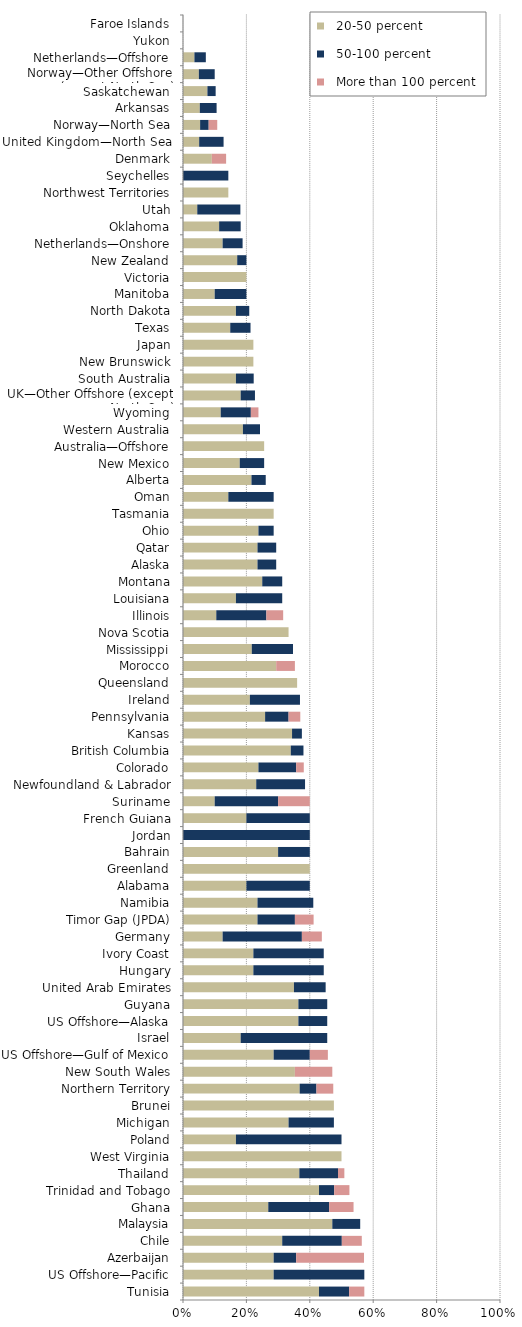
| Category |   20-50 percent |   50-100 percent |   More than 100 percent |
|---|---|---|---|
| Tunisia | 0.429 | 0.095 | 0.048 |
| US Offshore—Pacific | 0.286 | 0.286 | 0 |
| Azerbaijan | 0.286 | 0.071 | 0.214 |
| Chile | 0.313 | 0.188 | 0.063 |
| Malaysia | 0.471 | 0.088 | 0 |
| Ghana | 0.269 | 0.192 | 0.077 |
| Trinidad and Tobago | 0.429 | 0.048 | 0.048 |
| Thailand | 0.367 | 0.122 | 0.02 |
| West Virginia | 0.5 | 0 | 0 |
| Poland | 0.167 | 0.333 | 0 |
| Michigan | 0.333 | 0.143 | 0 |
| Brunei | 0.476 | 0 | 0 |
| Northern Territory | 0.368 | 0.053 | 0.053 |
| New South Wales | 0.353 | 0 | 0.118 |
| US Offshore—Gulf of Mexico | 0.286 | 0.114 | 0.057 |
| Israel | 0.182 | 0.273 | 0 |
| US Offshore—Alaska | 0.364 | 0.091 | 0 |
| Guyana | 0.364 | 0.091 | 0 |
| United Arab Emirates | 0.35 | 0.1 | 0 |
| Hungary | 0.222 | 0.222 | 0 |
| Ivory Coast | 0.222 | 0.222 | 0 |
| Germany | 0.125 | 0.25 | 0.063 |
| Timor Gap (JPDA) | 0.235 | 0.118 | 0.059 |
| Namibia | 0.235 | 0.176 | 0 |
| Alabama | 0.2 | 0.2 | 0 |
| Greenland | 0.4 | 0 | 0 |
| Bahrain | 0.3 | 0.1 | 0 |
| Jordan | 0 | 0.4 | 0 |
| French Guiana | 0.2 | 0.2 | 0 |
| Suriname | 0.1 | 0.2 | 0.1 |
| Newfoundland & Labrador | 0.231 | 0.154 | 0 |
| Colorado | 0.238 | 0.119 | 0.024 |
| British Columbia | 0.34 | 0.04 | 0 |
| Kansas | 0.344 | 0.031 | 0 |
| Pennsylvania | 0.259 | 0.074 | 0.037 |
| Ireland | 0.211 | 0.158 | 0 |
| Queensland | 0.36 | 0 | 0 |
| Morocco | 0.294 | 0 | 0.059 |
| Mississippi | 0.217 | 0.13 | 0 |
| Nova Scotia | 0.333 | 0 | 0 |
| Illinois | 0.105 | 0.158 | 0.053 |
| Louisiana | 0.167 | 0.146 | 0 |
| Montana | 0.25 | 0.063 | 0 |
| Alaska | 0.235 | 0.059 | 0 |
| Qatar | 0.235 | 0.059 | 0 |
| Ohio | 0.238 | 0.048 | 0 |
| Tasmania | 0.286 | 0 | 0 |
| Oman | 0.143 | 0.143 | 0 |
| Alberta | 0.216 | 0.045 | 0 |
| New Mexico | 0.179 | 0.077 | 0 |
| Australia—Offshore | 0.256 | 0 | 0 |
| Western Australia | 0.189 | 0.054 | 0 |
| Wyoming | 0.119 | 0.095 | 0.024 |
| UK—Other Offshore (except North Sea) | 0.182 | 0.045 | 0 |
| South Australia | 0.167 | 0.056 | 0 |
| New Brunswick | 0.222 | 0 | 0 |
| Japan | 0.222 | 0 | 0 |
| Texas | 0.149 | 0.064 | 0 |
| North Dakota | 0.167 | 0.042 | 0 |
| Manitoba | 0.1 | 0.1 | 0 |
| Victoria | 0.2 | 0 | 0 |
| New Zealand | 0.171 | 0.029 | 0 |
| Netherlands—Onshore | 0.125 | 0.063 | 0 |
| Oklahoma | 0.114 | 0.068 | 0 |
| Utah | 0.045 | 0.136 | 0 |
| Northwest Territories | 0.143 | 0 | 0 |
| Seychelles | 0 | 0.143 | 0 |
| Denmark | 0.091 | 0 | 0.045 |
| United Kingdom—North Sea | 0.051 | 0.077 | 0 |
| Norway—North Sea | 0.054 | 0.027 | 0.027 |
| Arkansas | 0.053 | 0.053 | 0 |
| Saskatchewan | 0.077 | 0.026 | 0 |
| Norway—Other Offshore (except North Sea) | 0.05 | 0.05 | 0 |
| Netherlands—Offshore | 0.036 | 0.036 | 0 |
| Yukon | 0 | 0 | 0 |
| Faroe Islands | 0 | 0 | 0 |